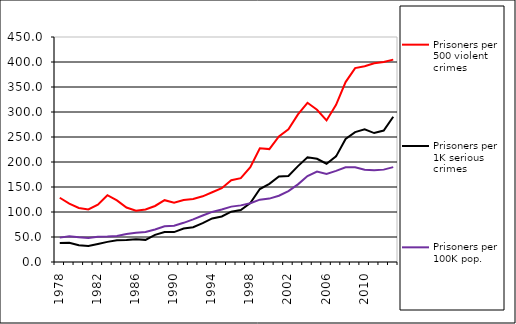
| Category | Prisoners per 500 violent crimes | Prisoners per 1K serious crimes | Prisoners per 100K pop. |
|---|---|---|---|
| 1978.0 | 128.536 | 37.987 | 48.752 |
| 1979.0 | 116.683 | 38.666 | 51.576 |
| 1980.0 | 108.162 | 33.432 | 49.271 |
| 1981.0 | 105.201 | 31.917 | 48.068 |
| 1982.0 | 114.82 | 35.931 | 50.351 |
| 1983.0 | 133.582 | 40.263 | 50.989 |
| 1984.0 | 123.097 | 43.302 | 52.066 |
| 1985.0 | 108.967 | 43.865 | 55.879 |
| 1986.0 | 102.66 | 45.332 | 58.424 |
| 1987.0 | 105.05 | 44.277 | 59.962 |
| 1988.0 | 112.05 | 54.184 | 65.002 |
| 1989.0 | 123.635 | 60.146 | 71.284 |
| 1990.0 | 118.578 | 59.831 | 72.593 |
| 1991.0 | 123.947 | 66.978 | 78.339 |
| 1992.0 | 126.189 | 69.487 | 85.312 |
| 1993.0 | 131.365 | 77.587 | 92.982 |
| 1994.0 | 139.507 | 87.053 | 100.175 |
| 1995.0 | 147.6 | 91.138 | 105.119 |
| 1996.0 | 163.414 | 100.552 | 110.734 |
| 1997.0 | 167.625 | 103.852 | 113.231 |
| 1998.0 | 189.581 | 117.878 | 117.608 |
| 1999.0 | 227.551 | 145.988 | 124.699 |
| 2000.0 | 225.802 | 156.227 | 126.802 |
| 2001.0 | 251.274 | 170.958 | 132.53 |
| 2002.0 | 265.453 | 171.941 | 141.877 |
| 2003.0 | 295.321 | 191.764 | 155.307 |
| 2004.0 | 318.45 | 209.527 | 171.842 |
| 2005.0 | 304.435 | 206.433 | 181.031 |
| 2006.0 | 283.103 | 196.518 | 176.269 |
| 2007.0 | 314.426 | 211.283 | 182.16 |
| 2008.0 | 359.814 | 246.187 | 189.463 |
| 2009.0 | 387.836 | 259.687 | 189.624 |
| 2010.0 | 391.37 | 265.259 | 184.693 |
| 2011.0 | 397.63 | 257.868 | 183.27 |
| 2012.0 | 400.113 | 262.931 | 184.733 |
| 2013.0 | 404.76 | 290.461 | 189.762 |